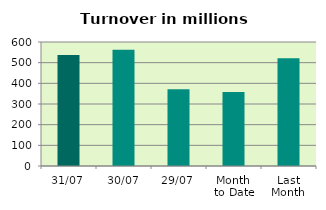
| Category | Series 0 |
|---|---|
| 31/07 | 536.698 |
| 30/07 | 562.888 |
| 29/07 | 371.599 |
| Month 
to Date | 357.784 |
| Last
Month | 521.023 |